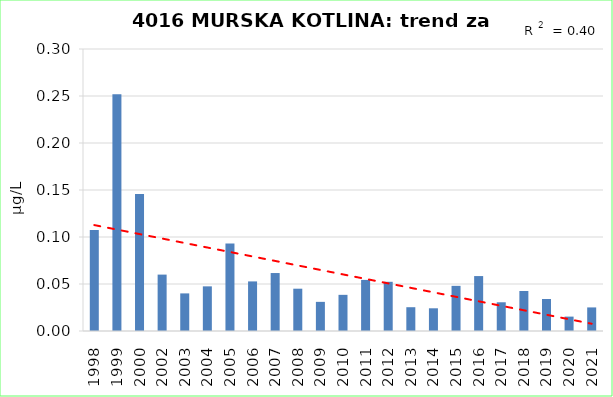
| Category | Vsota |
|---|---|
| 1998 | 0.108 |
| 1999 | 0.252 |
| 2000 | 0.146 |
| 2002 | 0.06 |
| 2003 | 0.04 |
| 2004 | 0.048 |
| 2005 | 0.093 |
| 2006 | 0.053 |
| 2007 | 0.062 |
| 2008 | 0.045 |
| 2009 | 0.031 |
| 2010 | 0.038 |
| 2011 | 0.054 |
| 2012 | 0.052 |
| 2013 | 0.025 |
| 2014 | 0.024 |
| 2015 | 0.048 |
| 2016 | 0.058 |
| 2017 | 0.031 |
| 2018 | 0.043 |
| 2019 | 0.034 |
| 2020 | 0.015 |
| 2021 | 0.025 |